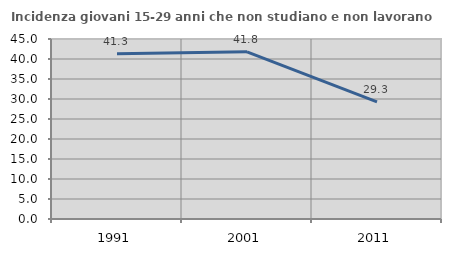
| Category | Incidenza giovani 15-29 anni che non studiano e non lavorano  |
|---|---|
| 1991.0 | 41.339 |
| 2001.0 | 41.797 |
| 2011.0 | 29.301 |